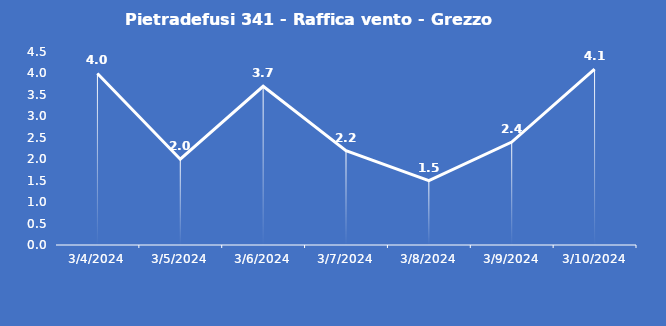
| Category | Pietradefusi 341 - Raffica vento - Grezzo (m/s) |
|---|---|
| 3/4/24 | 4 |
| 3/5/24 | 2 |
| 3/6/24 | 3.7 |
| 3/7/24 | 2.2 |
| 3/8/24 | 1.5 |
| 3/9/24 | 2.4 |
| 3/10/24 | 4.1 |